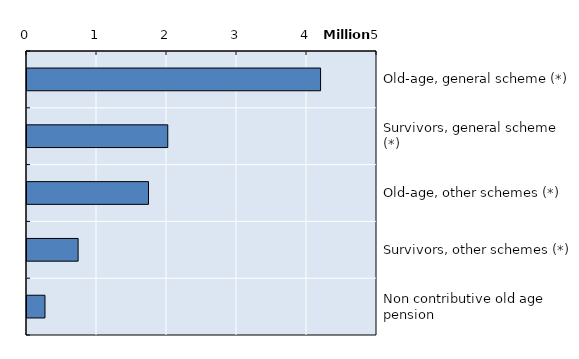
| Category | Series 0 |
|---|---|
| Old-age, general scheme (*) | 4193915.083 |
| Survivors, general scheme (*) | 2011050 |
| Old-age, other schemes (*) | 1735555.833 |
| Survivors, other schemes (*) | 730159.75 |
| Non contributive old age pension | 256842 |